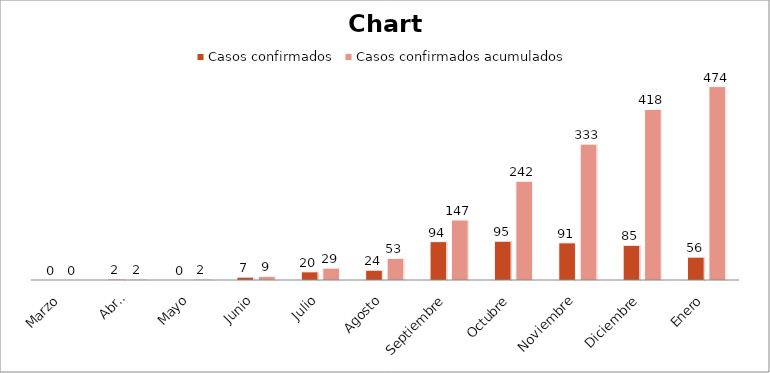
| Category | Casos confirmados | Casos confirmados acumulados |
|---|---|---|
| Marzo | 0 | 0 |
| Abril | 2 | 2 |
| Mayo | 0 | 2 |
| Junio | 7 | 9 |
| Julio | 20 | 29 |
| Agosto | 24 | 53 |
| Septiembre  | 94 | 147 |
| Octubre | 95 | 242 |
| Noviembre | 91 | 333 |
| Diciembre | 85 | 418 |
| Enero | 56 | 474 |